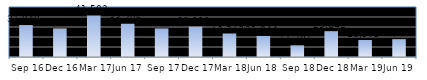
| Category | Series 0 |
|---|---|
| Sep 16 | 31949 |
| Dec 16 | 28460 |
| Mar 17 | 41502 |
| Jun 17 | 33206 |
| Sep 17 | 28578 |
| Dec 17 | 30292 |
| Mar 18 | 23529 |
| Jun 18 | 21044 |
| Sep 18 | 11701 |
| Dec 18 | 25841 |
| Mar 19 | 16975 |
| Jun 19 | 17846 |